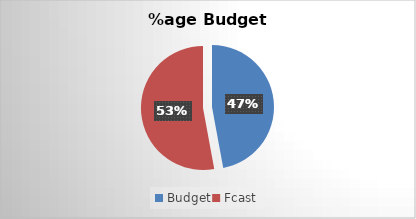
| Category | Series 0 |
|---|---|
| Budget | 1177.304 |
| Fcast | 1322.696 |